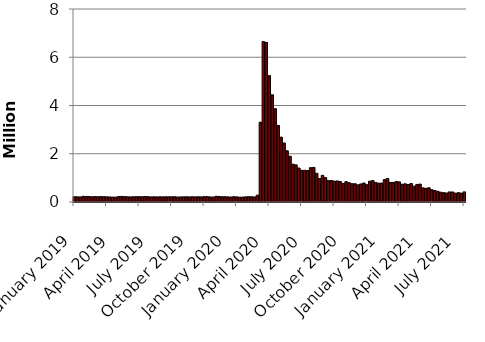
| Category | Series 0 |
|---|---|
| January 2019 | 220000 |
| January 2019 | 216000 |
| January 2019 | 209000 |
| January 2019 | 236000 |
| February 2019 | 230000 |
| February 2019 | 228000 |
| February 2019 | 218000 |
| February 2019 | 224000 |
| March 2019 | 220000 |
| March 2019 | 224000 |
| March 2019 | 219000 |
| March 2019 | 215000 |
| March 2019 | 211000 |
| April 2019 | 203000 |
| April 2019 | 203000 |
| April 2019 | 226000 |
| April 2019 | 230000 |
| May 2019 | 225000 |
| May 2019 | 217000 |
| May 2019 | 213000 |
| May 2019 | 218000 |
| June 2019 | 220000 |
| June 2019 | 220000 |
| June 2019 | 219000 |
| June 2019 | 224000 |
| June 2019 | 222000 |
| July 2019 | 211000 |
| July 2019 | 217000 |
| July 2019 | 211000 |
| July 2019 | 216000 |
| August 2019 | 214000 |
| August 2019 | 218000 |
| August 2019 | 215000 |
| August 2019 | 215000 |
| August 2019 | 219000 |
| September 2019 | 208000 |
| September 2019 | 211000 |
| September 2019 | 215000 |
| September 2019 | 218000 |
| October 2019 | 212000 |
| October 2019 | 218000 |
| September 2019 | 213000 |
| September 2019 | 217000 |
| November 2019 | 212000 |
| November 2019 | 222000 |
| November 2019 | 223000 |
| November 2019 | 211000 |
| November 2019 | 206000 |
| December 2019 | 237000 |
| December 2019 | 229000 |
| December 2019 | 218000 |
| December 2019 | 220000 |
| January 2020 | 212000 |
| January 2020 | 207000 |
| January 2020 | 220000 |
| January 2020 | 212000 |
| February 2020 | 201000 |
| February 2020 | 204000 |
| February 2020 | 215000 |
| February 2020 | 220000 |
| February 2020 | 217000 |
| March 2020 | 211000 |
| March 2020 | 282000 |
| 2020 Mar | 3307000 |
| March 2020 | 6648000 |
| April 2020 | 6615000 |
| April 2020 | 5237000 |
| April 2020 | 4442000 |
| April 2020 | 3867000 |
| May 2020 | 3176000 |
| May 2020 | 2687000 |
| May 2020 | 2446000 |
| May 2020 | 2123000 |
| May 2020 | 1897000 |
| June 2020 | 1566000 |
| June 2020 | 1540000 |
| June 2020 | 1408000 |
| June 2020 | 1310000 |
| July 2020 | 1314000 |
| July 2020 | 1308000 |
| July 2020 | 1422000 |
| July 2020 | 1435000 |
| August 2020 | 1191000 |
| August 2020 | 971000 |
| August 2020 | 1104000 |
| August 2020 | 1011000 |
| August 2020 | 884000 |
| September 2020 | 893000 |
| September 2020 | 866000 |
| September 2020 | 873000 |
| September 2020 | 849000 |
| October 2020 | 767000 |
| October 2020 | 842000 |
| October 2020 | 797000 |
| October 2020 | 758000 |
| October 2020 | 757000 |
| November 2020 | 711000 |
| November 2020 | 748000 |
| November 2020 | 787000 |
| November 2020 | 716000 |
| December 2020 | 862000 |
| December 2020 | 885000 |
| Decmeber 2020 | 806000 |
| December 2020 | 782000 |
| January 2021 | 784000 |
| January 2021 | 927000 |
| January 2021 | 975000 |
| January 2021 | 812000 |
| January 2021 | 812000 |
| February 2021 | 848000 |
| February 2021 | 834000 |
| February 2021 | 736000 |
| February 2021 | 754000 |
| March 2021 | 725000 |
| March 2021 | 765000 |
| March 2021 | 658000 |
| March 2021 | 729000 |
| April 2021 | 742000 |
| April 2021 | 586000 |
| April 2021 | 566000 |
| April 2021 | 590000 |
| May 2021 | 507000 |
| May 2021 | 478000 |
| May 2021 | 444000 |
| May 2021 | 405000 |
| May 2021 | 388000 |
| June 2021 | 374000 |
| June 2021 | 418000 |
| June 2021 | 416000 |
| July 2021 | 368000 |
| July 2021 | 386000 |
| July 2021 | 368000 |
| July 2021 | 419000 |